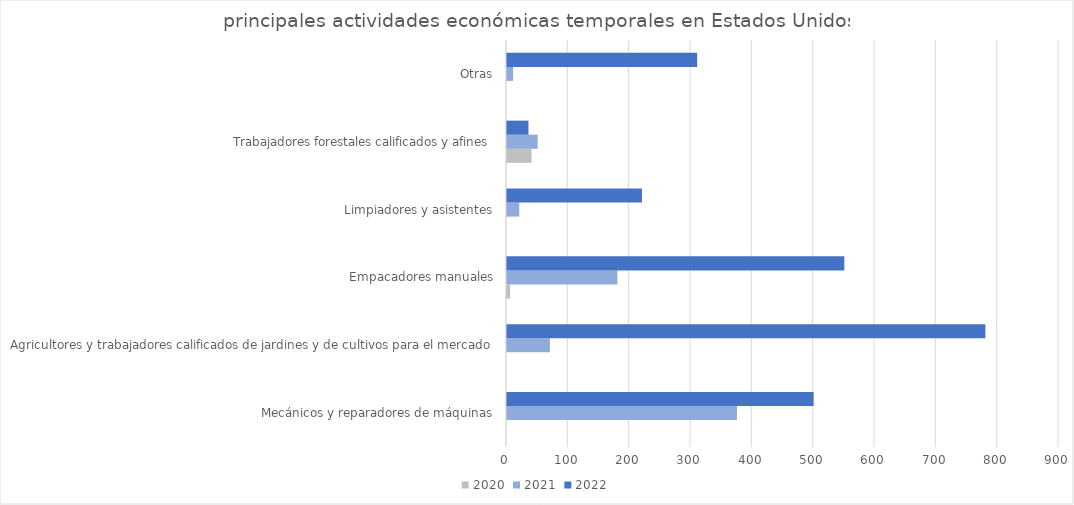
| Category | 2020 | 2021 | 2022 |
|---|---|---|---|
| Mecánicos y reparadores de máquinas | 0 | 375 | 500 |
| Agricultores y trabajadores calificados de jardines y de cultivos para el mercado | 0 | 70 | 780 |
| Empacadores manuales | 5 | 180 | 550 |
| Limpiadores y asistentes | 0 | 20 | 220 |
| Trabajadores forestales calificados y afines | 40 | 50 | 35 |
| Otras | 0 | 10 | 310 |